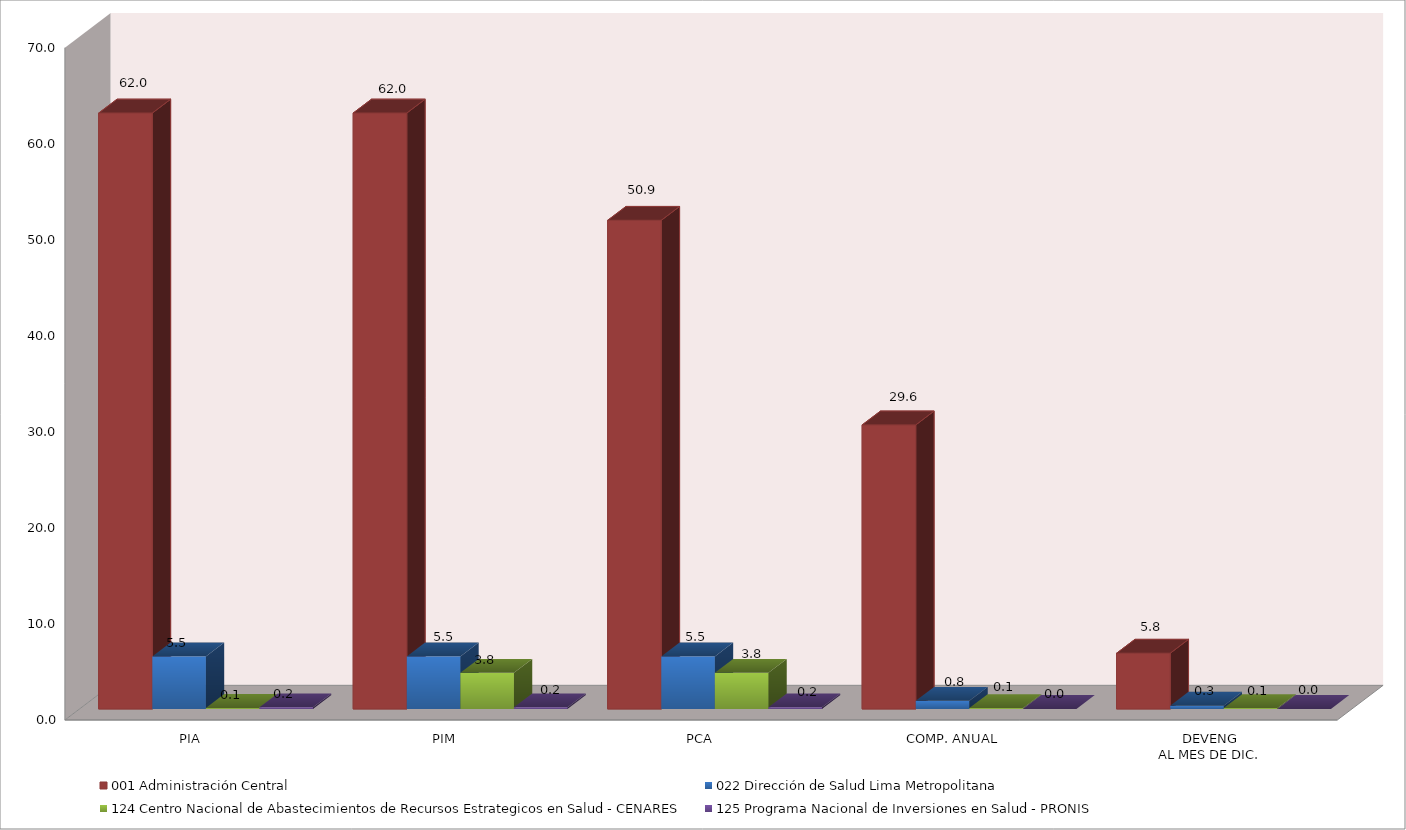
| Category | 001 Administración Central | 022 Dirección de Salud Lima Metropolitana | 124 Centro Nacional de Abastecimientos de Recursos Estrategicos en Salud - CENARES | 125 Programa Nacional de Inversiones en Salud - PRONIS |
|---|---|---|---|---|
| PIA | 62.041 | 5.464 | 0.1 | 0.163 |
| PIM | 62.041 | 5.464 | 3.764 | 0.163 |
| PCA | 50.873 | 5.464 | 3.764 | 0.163 |
| COMP. ANUAL | 29.57 | 0.845 | 0.088 | 0 |
| DEVENG
AL MES DE DIC. | 5.802 | 0.333 | 0.085 | 0 |